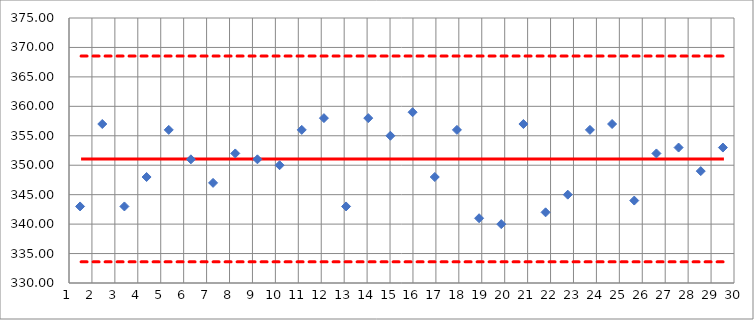
| Category | Média | LS | LI |
|---|---|---|---|
| 1.0 | 351.067 | 368.541 | 333.593 |
| 2.0 | 351.067 | 368.541 | 333.593 |
| 3.0 | 351.067 | 368.541 | 333.593 |
| 4.0 | 351.067 | 368.541 | 333.593 |
| 5.0 | 351.067 | 368.541 | 333.593 |
| 6.0 | 351.067 | 368.541 | 333.593 |
| 7.0 | 351.067 | 368.541 | 333.593 |
| 8.0 | 351.067 | 368.541 | 333.593 |
| 9.0 | 351.067 | 368.541 | 333.593 |
| 10.0 | 351.067 | 368.541 | 333.593 |
| 11.0 | 351.067 | 368.541 | 333.593 |
| 12.0 | 351.067 | 368.541 | 333.593 |
| 13.0 | 351.067 | 368.541 | 333.593 |
| 14.0 | 351.067 | 368.541 | 333.593 |
| 15.0 | 351.067 | 368.541 | 333.593 |
| 16.0 | 351.067 | 368.541 | 333.593 |
| 17.0 | 351.067 | 368.541 | 333.593 |
| 18.0 | 351.067 | 368.541 | 333.593 |
| 19.0 | 351.067 | 368.541 | 333.593 |
| 20.0 | 351.067 | 368.541 | 333.593 |
| 21.0 | 351.067 | 368.541 | 333.593 |
| 22.0 | 351.067 | 368.541 | 333.593 |
| 23.0 | 351.067 | 368.541 | 333.593 |
| 24.0 | 351.067 | 368.541 | 333.593 |
| 25.0 | 351.067 | 368.541 | 333.593 |
| 26.0 | 351.067 | 368.541 | 333.593 |
| 27.0 | 351.067 | 368.541 | 333.593 |
| 28.0 | 351.067 | 368.541 | 333.593 |
| 29.0 | 351.067 | 368.541 | 333.593 |
| 30.0 | 351.067 | 368.541 | 333.593 |